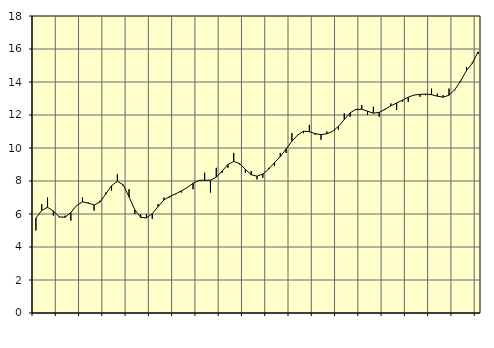
| Category | Piggar | Series 1 |
|---|---|---|
| nan | 5 | 5.75 |
| 1.0 | 6.6 | 6.22 |
| 1.0 | 7 | 6.41 |
| 1.0 | 5.9 | 6.18 |
| nan | 5.8 | 5.83 |
| 2.0 | 5.9 | 5.8 |
| 2.0 | 5.6 | 6.09 |
| 2.0 | 6.5 | 6.51 |
| nan | 7 | 6.74 |
| 3.0 | 6.7 | 6.66 |
| 3.0 | 6.2 | 6.55 |
| 3.0 | 6.8 | 6.72 |
| nan | 7.3 | 7.21 |
| 4.0 | 7.4 | 7.71 |
| 4.0 | 8.4 | 7.98 |
| 4.0 | 7.7 | 7.77 |
| nan | 7.5 | 7.04 |
| 5.0 | 6 | 6.26 |
| 5.0 | 6 | 5.8 |
| 5.0 | 6 | 5.76 |
| nan | 5.7 | 6.02 |
| 6.0 | 6.6 | 6.45 |
| 6.0 | 7 | 6.85 |
| 6.0 | 7 | 7.06 |
| nan | 7.2 | 7.22 |
| 7.0 | 7.3 | 7.4 |
| 7.0 | 7.6 | 7.6 |
| 7.0 | 7.5 | 7.86 |
| nan | 8 | 8.04 |
| 8.0 | 8.5 | 8.04 |
| 8.0 | 7.3 | 8.05 |
| 8.0 | 8.8 | 8.23 |
| nan | 8.5 | 8.6 |
| 9.0 | 8.8 | 9 |
| 9.0 | 9.7 | 9.18 |
| 9.0 | 9 | 9.06 |
| nan | 8.5 | 8.7 |
| 10.0 | 8.6 | 8.38 |
| 10.0 | 8.1 | 8.29 |
| 10.0 | 8.2 | 8.42 |
| nan | 8.8 | 8.72 |
| 11.0 | 8.9 | 9.11 |
| 11.0 | 9.7 | 9.48 |
| 11.0 | 9.7 | 9.94 |
| nan | 10.9 | 10.41 |
| 12.0 | 10.8 | 10.79 |
| 12.0 | 10.9 | 11.02 |
| 12.0 | 11.4 | 10.99 |
| nan | 10.8 | 10.87 |
| 13.0 | 10.5 | 10.81 |
| 13.0 | 11 | 10.86 |
| 13.0 | 11 | 11.01 |
| nan | 11.1 | 11.31 |
| 14.0 | 12.1 | 11.73 |
| 14.0 | 11.9 | 12.13 |
| 14.0 | 12.3 | 12.34 |
| nan | 12.6 | 12.35 |
| 15.0 | 12 | 12.23 |
| 15.0 | 12.5 | 12.11 |
| 15.0 | 11.9 | 12.16 |
| nan | 12.3 | 12.35 |
| 16.0 | 12.7 | 12.55 |
| 16.0 | 12.3 | 12.73 |
| 16.0 | 12.8 | 12.9 |
| nan | 12.8 | 13.08 |
| 17.0 | 13.2 | 13.21 |
| 17.0 | 13.1 | 13.25 |
| 17.0 | 13.2 | 13.27 |
| nan | 13.6 | 13.23 |
| 18.0 | 13.3 | 13.14 |
| 18.0 | 13.2 | 13.08 |
| 18.0 | 13.6 | 13.2 |
| nan | 13.5 | 13.53 |
| 19.0 | 14 | 14.07 |
| 19.0 | 14.9 | 14.69 |
| 19.0 | 15.2 | 15.13 |
| nan | 15.7 | 15.83 |